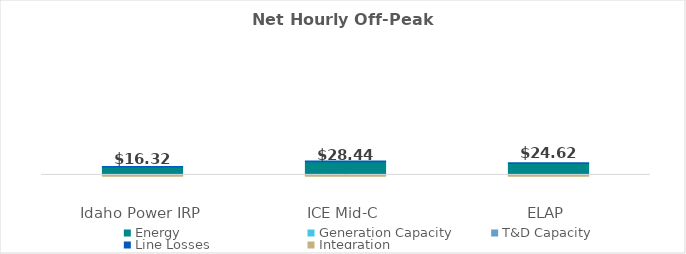
| Category | Energy | Generation Capacity | T&D Capacity | Line Losses | Integration |
|---|---|---|---|---|---|
| 0 | 18.193 | 0 | 0 | 1.055 | -2.93 |
| 1 | 29.651 | 0 | 0 | 1.72 | -2.93 |
| 2 | 26.04 | 0 | 0 | 1.51 | -2.93 |